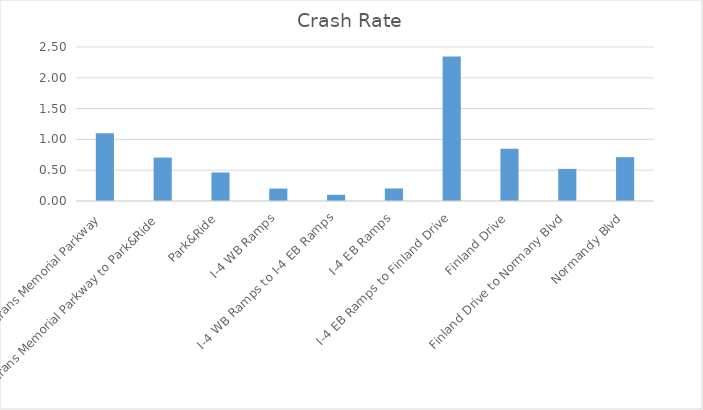
| Category | Crash Rate |
|---|---|
| Veterans Memorial Parkway | 1.1 |
| Veterans Memorial Parkway to Park&Ride | 0.706 |
| Park&Ride | 0.463 |
| I-4 WB Ramps | 0.201 |
| I-4 WB Ramps to I-4 EB Ramps | 0.101 |
| I-4 EB Ramps | 0.204 |
| I-4 EB Ramps to Finland Drive | 2.346 |
| Finland Drive | 0.846 |
| Finland Drive to Normany Blvd | 0.521 |
| Normandy Blvd | 0.711 |